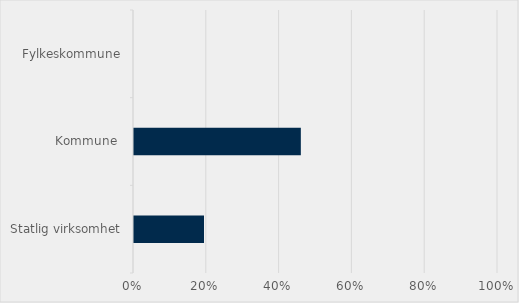
| Category | Series 0 |
|---|---|
| Statlig virksomhet | 0.192 |
| Kommune  | 0.458 |
| Fylkeskommune | 0 |